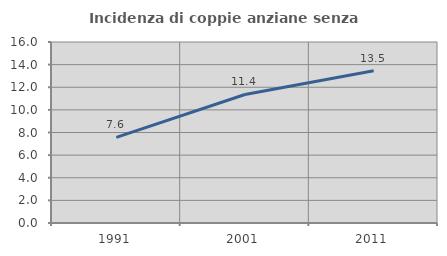
| Category | Incidenza di coppie anziane senza figli  |
|---|---|
| 1991.0 | 7.574 |
| 2001.0 | 11.362 |
| 2011.0 | 13.463 |